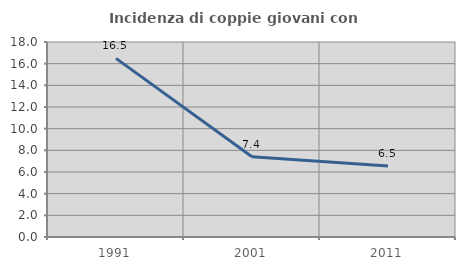
| Category | Incidenza di coppie giovani con figli |
|---|---|
| 1991.0 | 16.489 |
| 2001.0 | 7.407 |
| 2011.0 | 6.548 |